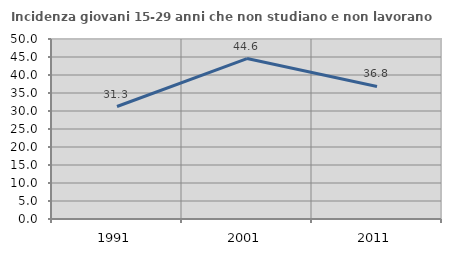
| Category | Incidenza giovani 15-29 anni che non studiano e non lavorano  |
|---|---|
| 1991.0 | 31.25 |
| 2001.0 | 44.561 |
| 2011.0 | 36.822 |